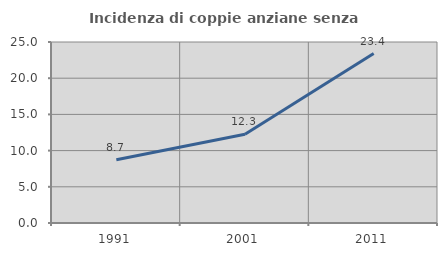
| Category | Incidenza di coppie anziane senza figli  |
|---|---|
| 1991.0 | 8.738 |
| 2001.0 | 12.264 |
| 2011.0 | 23.404 |